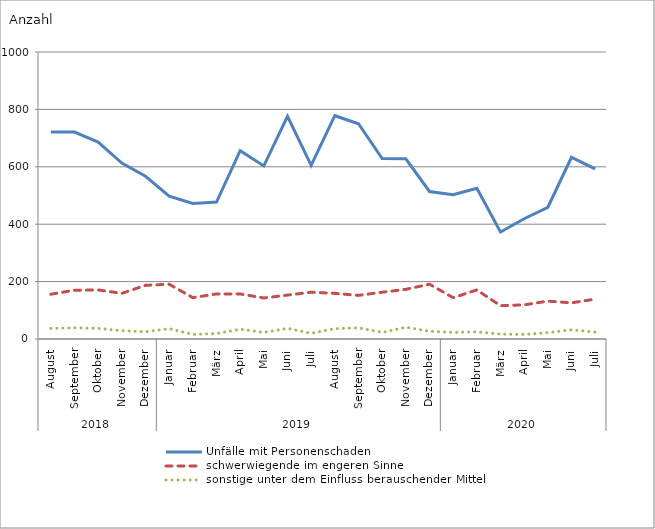
| Category | Unfälle mit Personenschaden | schwerwiegende im engeren Sinne | sonstige unter dem Einfluss berauschender Mittel |
|---|---|---|---|
| 0 | 721 | 156 | 37 |
| 1 | 721 | 170 | 39 |
| 2 | 686 | 171 | 37 |
| 3 | 613 | 159 | 29 |
| 4 | 567 | 187 | 25 |
| 5 | 498 | 191 | 36 |
| 6 | 472 | 144 | 16 |
| 7 | 477 | 157 | 19 |
| 8 | 656 | 157 | 34 |
| 9 | 603 | 143 | 23 |
| 10 | 776 | 153 | 37 |
| 11 | 605 | 163 | 20 |
| 12 | 778 | 159 | 36 |
| 13 | 750 | 152 | 39 |
| 14 | 629 | 163 | 23 |
| 15 | 628 | 173 | 41 |
| 16 | 514 | 191 | 27 |
| 17 | 503 | 144 | 23 |
| 18 | 525 | 171 | 25 |
| 19 | 373 | 116 | 17 |
| 20 | 419 | 119 | 16 |
| 21 | 459 | 132 | 22 |
| 22 | 633 | 126 | 32 |
| 23 | 593 | 139 | 24 |